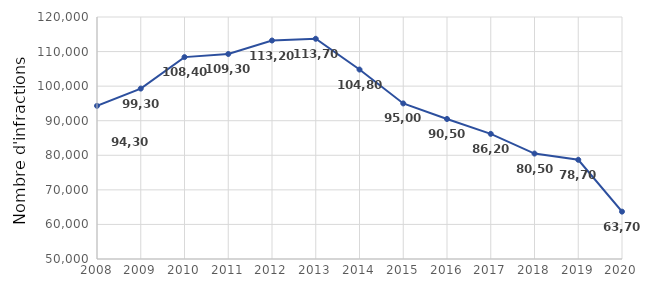
| Category | Series 0 |
|---|---|
| 2008.0 | 94300 |
| 2009.0 | 99300 |
| 2010.0 | 108400 |
| 2011.0 | 109300 |
| 2012.0 | 113200 |
| 2013.0 | 113700 |
| 2014.0 | 104800 |
| 2015.0 | 95000 |
| 2016.0 | 90500 |
| 2017.0 | 86200 |
| 2018.0 | 80500 |
| 2019.0 | 78700 |
| 2020.0 | 63700 |